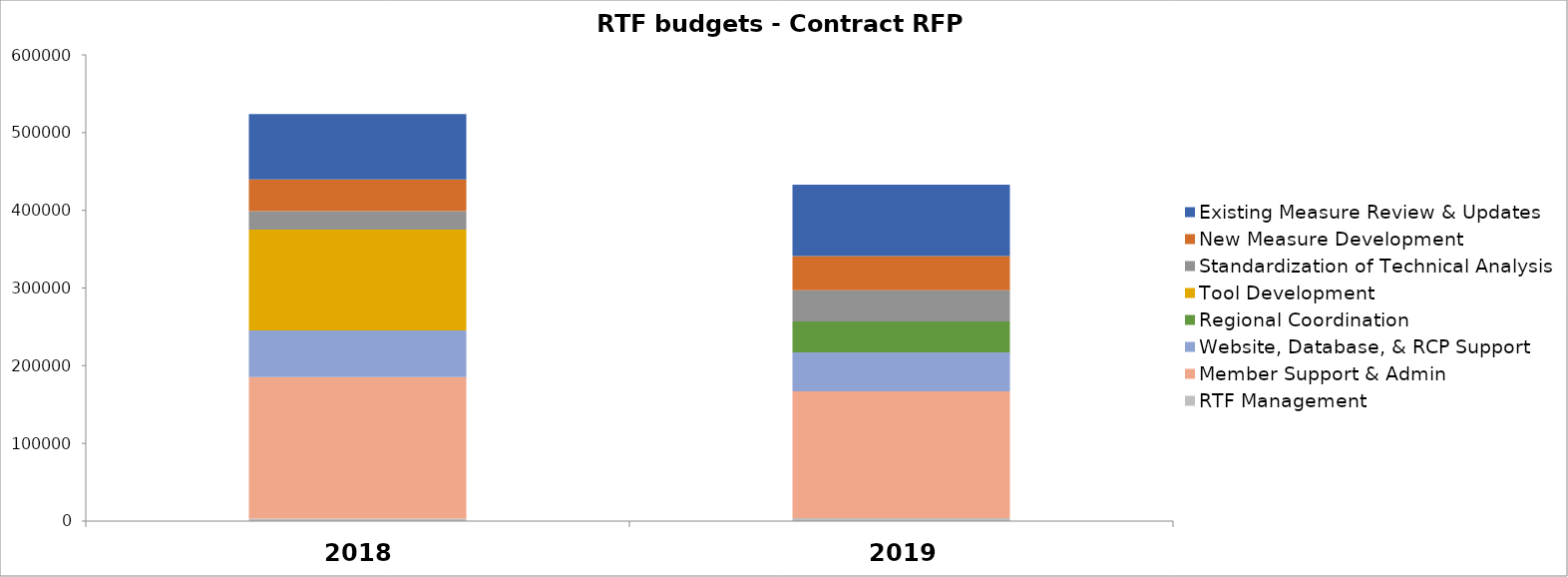
| Category | RTF Management | Member Support & Admin | Website, Database, & RCP Support | Regional Coordination | Tool Development | Standardization of Technical Analysis | New Measure Development | Existing Measure Review & Updates |
|---|---|---|---|---|---|---|---|---|
| 0 | 3300 | 182000 | 60000 | 0 | 130000 | 23500 | 41000 | 84000 |
| 1 | 4000 | 163000 | 50000 | 40000 | 0 | 40000 | 44000 | 92000 |